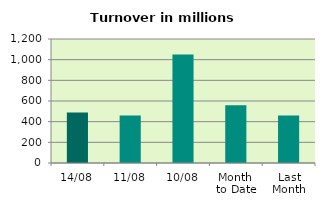
| Category | Series 0 |
|---|---|
| 14/08 | 489.322 |
| 11/08 | 460.545 |
| 10/08 | 1050.65 |
| Month 
to Date | 558.163 |
| Last
Month | 458.733 |